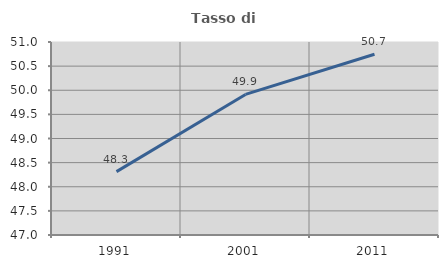
| Category | Tasso di occupazione   |
|---|---|
| 1991.0 | 48.314 |
| 2001.0 | 49.914 |
| 2011.0 | 50.746 |